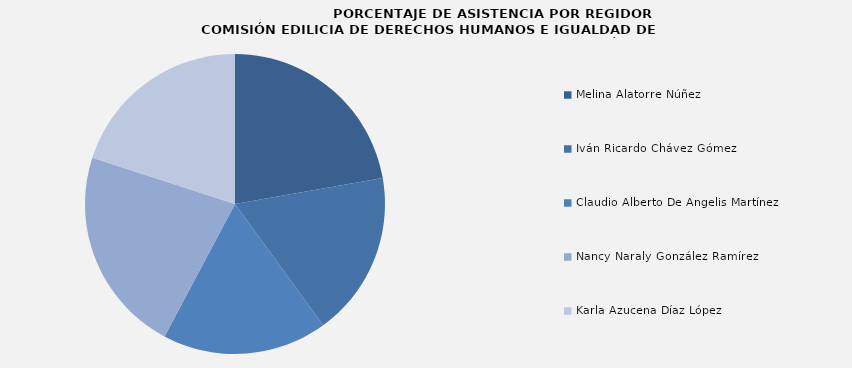
| Category | Series 0 |
|---|---|
| Melina Alatorre Núñez | 100 |
| Iván Ricardo Chávez Gómez | 80 |
| Claudio Alberto De Angelis Martínez | 80 |
| Nancy Naraly González Ramírez | 100 |
| Karla Azucena Díaz López | 90 |